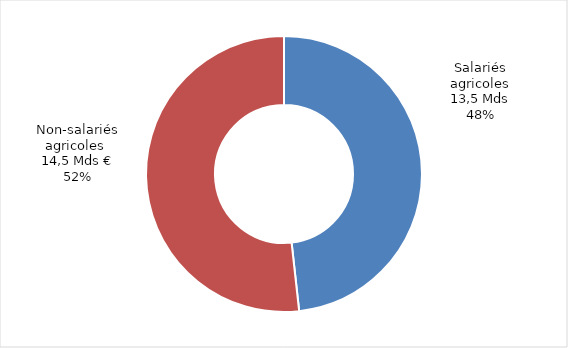
| Category | Series 0 |
|---|---|
| Salariés agricoles  | 13548.122 |
| Non-salariés agricoles | 14532.048 |